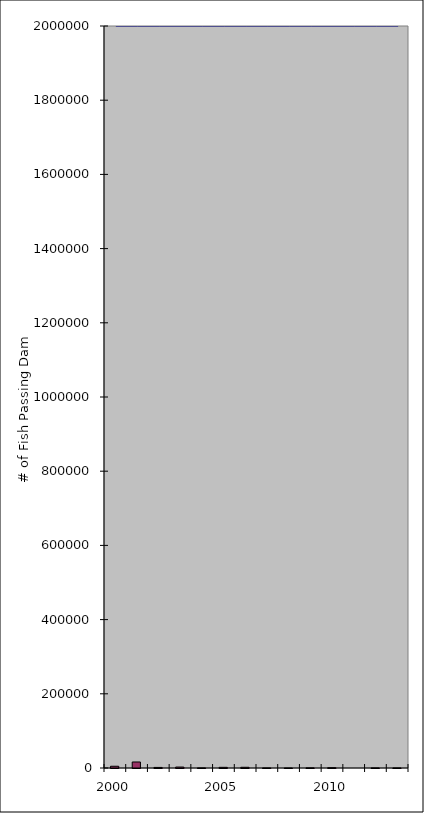
| Category | fish passed |
|---|---|
| 2000.0 | 4687 |
| 2001.0 | 16200 |
| 2002.0 | 1555 |
| 2003.0 | 2536 |
| 2004.0 | 219 |
| 2005.0 | 1772 |
| 2006.0 | 1913 |
| 2007.0 | 192 |
| 2008.0 | 21 |
| 2009.0 | 402 |
| 2010.0 | 907 |
| 2011.0 | 0 |
| 2012.0 | 224 |
| 2013.0 | 202 |